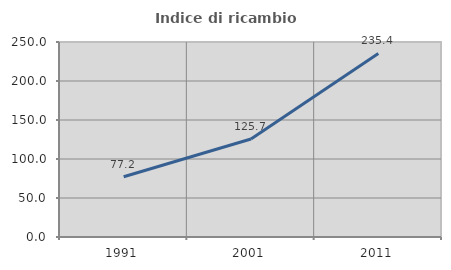
| Category | Indice di ricambio occupazionale  |
|---|---|
| 1991.0 | 77.25 |
| 2001.0 | 125.652 |
| 2011.0 | 235.404 |